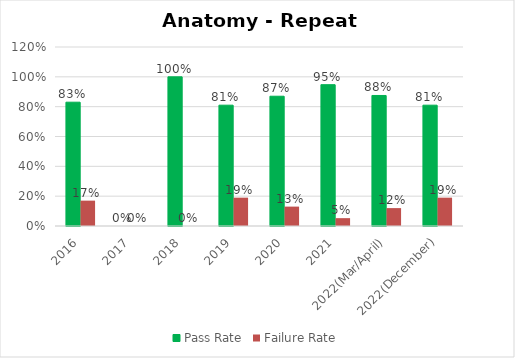
| Category | Pass Rate | Failure Rate |
|---|---|---|
| 2016 | 0.83 | 0.17 |
| 2017 | 0 | 0 |
| 2018 | 1 | 0 |
| 2019 | 0.81 | 0.19 |
| 2020 | 0.87 | 0.13 |
| 2021 | 0.947 | 0.053 |
| 2022(Mar/April) | 0.875 | 0.12 |
| 2022(December) | 0.81 | 0.19 |